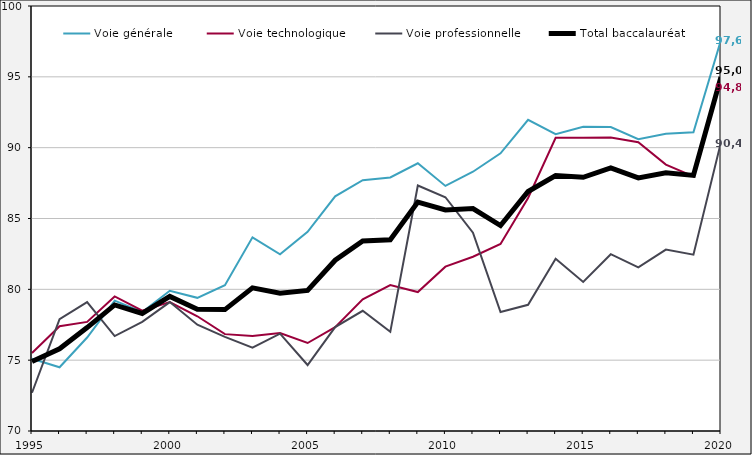
| Category | Voie générale  | Voie technologique | Voie professionnelle | Total baccalauréat |
|---|---|---|---|---|
| 1995 | 75.1 | 75.5 | 72.7 | 74.9 |
| 1996 | 74.5 | 77.4 | 77.9 | 75.8 |
| 1997 | 76.6 | 77.7 | 79.1 | 77.3 |
| 1998 | 79.2 | 79.5 | 76.7 | 78.9 |
| 1999 | 78.4 | 78.5 | 77.7 | 78.3 |
| 2000 | 79.9 | 79.1 | 79.1 | 79.5 |
| 2001 | 79.4 | 78.1 | 77.5 | 78.6 |
| 2002 | 80.297 | 76.838 | 76.645 | 78.57 |
| 2003 | 83.669 | 76.703 | 75.876 | 80.104 |
| 2004 | 82.477 | 76.92 | 76.873 | 79.725 |
| 2005 | 84.065 | 76.211 | 74.657 | 79.921 |
| 2006 | 86.566 | 77.333 | 77.333 | 82.056 |
| 2007 | 87.704 | 79.291 | 78.487 | 83.419 |
| 2008 | 87.9 | 80.3 | 77 | 83.5 |
| 2009 | 88.898 | 79.81 | 87.33 | 86.156 |
| 2010 | 87.3 | 81.6 | 86.5 | 85.6 |
| 2011 | 88.3 | 82.3 | 84 | 85.7 |
| 2012 | 89.6 | 83.2 | 78.4 | 84.5 |
| 2013 | 91.964 | 86.452 | 78.908 | 86.906 |
| 2014 | 90.953 | 90.702 | 82.162 | 88.031 |
| 2015 | 91.477 | 90.699 | 80.522 | 87.91 |
| 2016 | 91.452 | 90.724 | 82.48 | 88.575 |
| 2017 | 90.592 | 90.385 | 81.546 | 87.863 |
| 2018 | 90.979 | 88.808 | 82.806 | 88.233 |
| 2019 | 91.084 | 87.969 | 82.45 | 88.043 |
| 2020 | 97.6 | 94.8 | 90.4 | 95 |